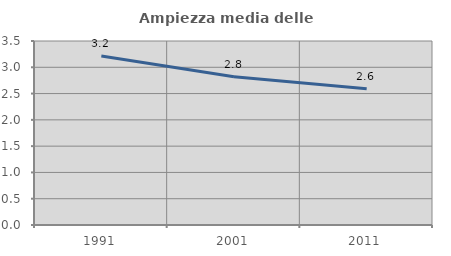
| Category | Ampiezza media delle famiglie |
|---|---|
| 1991.0 | 3.214 |
| 2001.0 | 2.818 |
| 2011.0 | 2.594 |